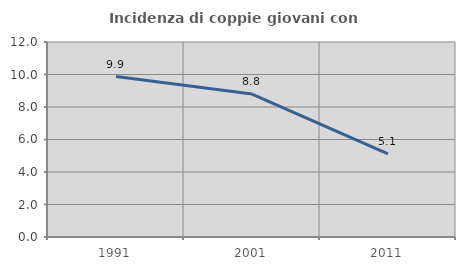
| Category | Incidenza di coppie giovani con figli |
|---|---|
| 1991.0 | 9.87 |
| 2001.0 | 8.796 |
| 2011.0 | 5.118 |